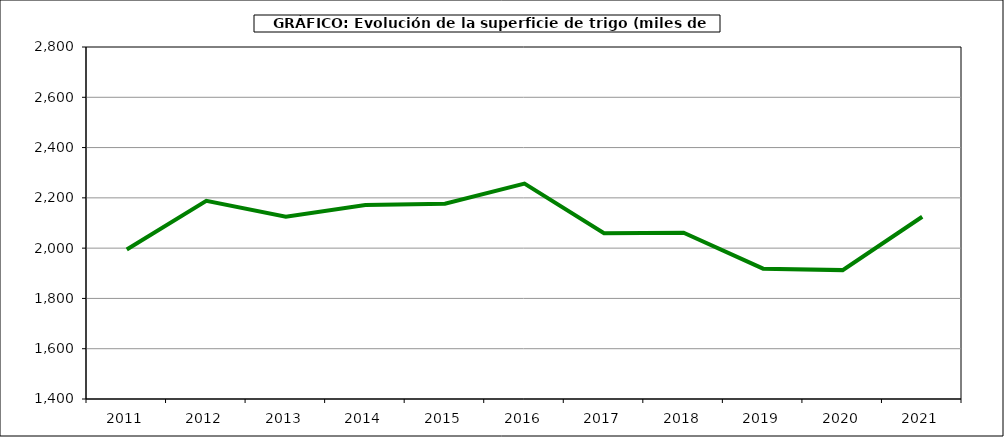
| Category | Superficie |
|---|---|
| 2011.0 | 1994.653 |
| 2012.0 | 2188.171 |
| 2013.0 | 2124.969 |
| 2014.0 | 2171.672 |
| 2015.0 | 2176.353 |
| 2016.0 | 2256.848 |
| 2017.0 | 2059.224 |
| 2018.0 | 2061.5 |
| 2019.0 | 1918.406 |
| 2020.0 | 1912.599 |
| 2021.0 | 2124.858 |